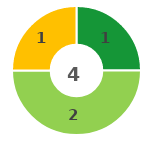
| Category | Series 0 |
|---|---|
| 0 | 1 |
| 1 | 2 |
| 2 | 1 |
| 3 | 0 |
| 4 | 0 |